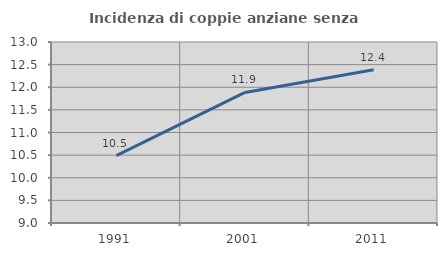
| Category | Incidenza di coppie anziane senza figli  |
|---|---|
| 1991.0 | 10.491 |
| 2001.0 | 11.886 |
| 2011.0 | 12.386 |